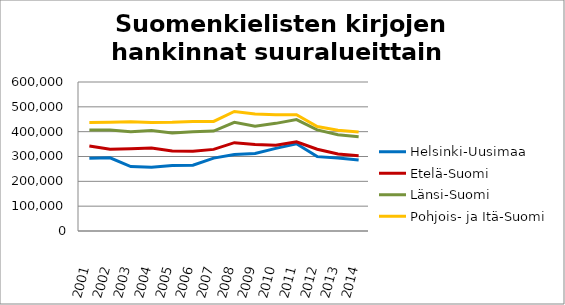
| Category | Helsinki-Uusimaa | Etelä-Suomi | Länsi-Suomi | Pohjois- ja Itä-Suomi |
|---|---|---|---|---|
| 2001.0 | 293345 | 341944 | 407145 | 437390 |
| 2002.0 | 294745 | 329111 | 406766 | 438085 |
| 2003.0 | 259279 | 331508 | 399610 | 439871 |
| 2004.0 | 256776 | 334633 | 404471 | 437073 |
| 2005.0 | 263618 | 321720 | 394707 | 437791 |
| 2006.0 | 264761 | 320774 | 399667 | 441279 |
| 2007.0 | 293399 | 328669 | 402189 | 441292 |
| 2008.0 | 308166 | 355750 | 437604 | 481357 |
| 2009.0 | 311955 | 348162 | 422345 | 470913 |
| 2010.0 | 332686 | 345695 | 433450 | 468235 |
| 2011.0 | 351409 | 358828 | 448504 | 468585 |
| 2012.0 | 299458 | 329446 | 407249 | 420905 |
| 2013.0 | 293896 | 310087 | 387971 | 406081 |
| 2014.0 | 285441 | 302902 | 379699 | 398301 |